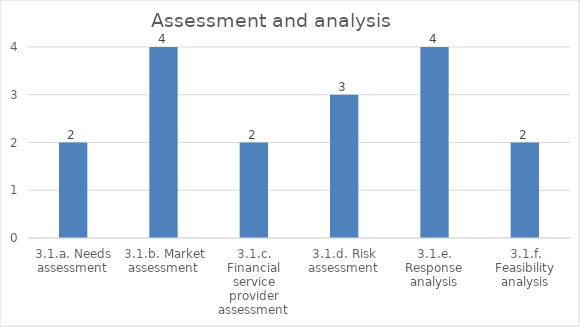
| Category | Assessment and analysis |
|---|---|
| 3.1.a. Needs assessment | 2 |
| 3.1.b. Market assessment | 4 |
| 3.1.c. Financial service provider assessment | 2 |
| 3.1.d. Risk assessment | 3 |
| 3.1.e. Response analysis | 4 |
| 3.1.f. Feasibility analysis | 2 |